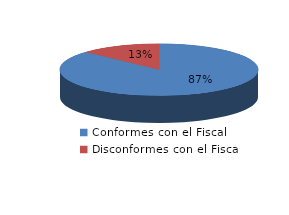
| Category | Series 0 |
|---|---|
| 0 | 436 |
| 1 | 66 |